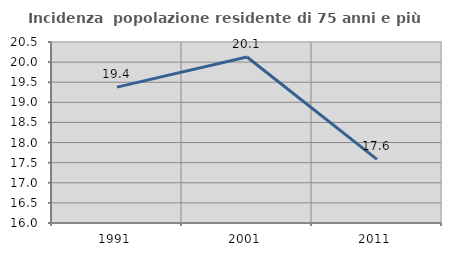
| Category | Incidenza  popolazione residente di 75 anni e più |
|---|---|
| 1991.0 | 19.379 |
| 2001.0 | 20.128 |
| 2011.0 | 17.581 |